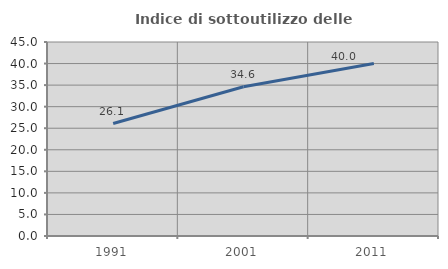
| Category | Indice di sottoutilizzo delle abitazioni  |
|---|---|
| 1991.0 | 26.094 |
| 2001.0 | 34.621 |
| 2011.0 | 40.03 |